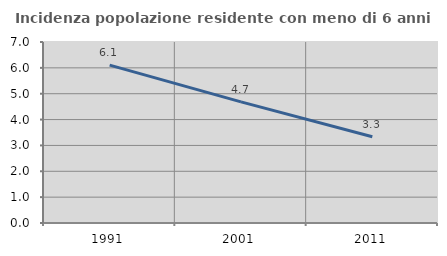
| Category | Incidenza popolazione residente con meno di 6 anni |
|---|---|
| 1991.0 | 6.107 |
| 2001.0 | 4.686 |
| 2011.0 | 3.337 |